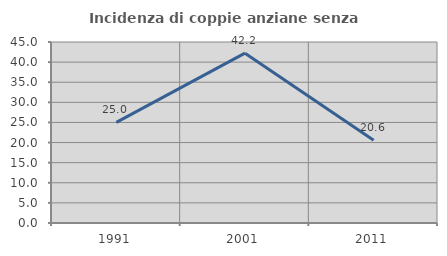
| Category | Incidenza di coppie anziane senza figli  |
|---|---|
| 1991.0 | 25 |
| 2001.0 | 42.222 |
| 2011.0 | 20.588 |